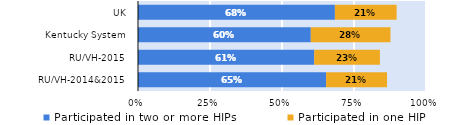
| Category | Participated in two or more HIPs | Participated in one HIP |
|---|---|---|
| RU/VH-2014&2015 | 0.653 | 0.212 |
| RU/VH-2015 | 0.612 | 0.228 |
| Kentucky System | 0.6 | 0.277 |
| UK | 0.684 | 0.214 |